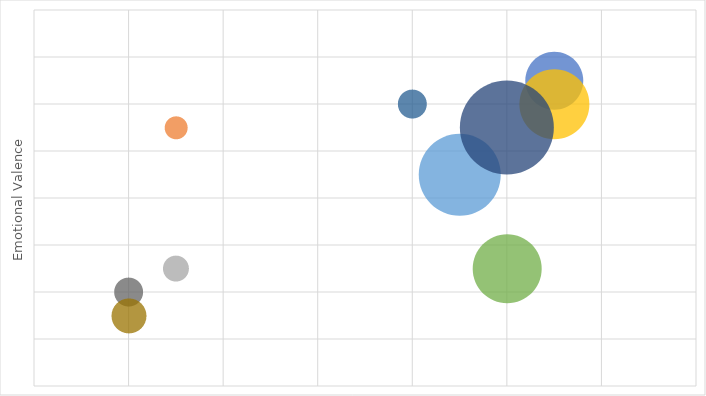
| Category | Arousal |
|---|---|
| 5.0 | 5 |
| -3.0 | 3 |
| -3.0 | -3 |
| 5.0 | 4 |
| 3.0 | 1 |
| 4.0 | -3 |
| 4.0 | 3 |
| 0.0 | 0 |
| -4.0 | -4 |
| -4.0 | -5 |
| 2.0 | 4 |